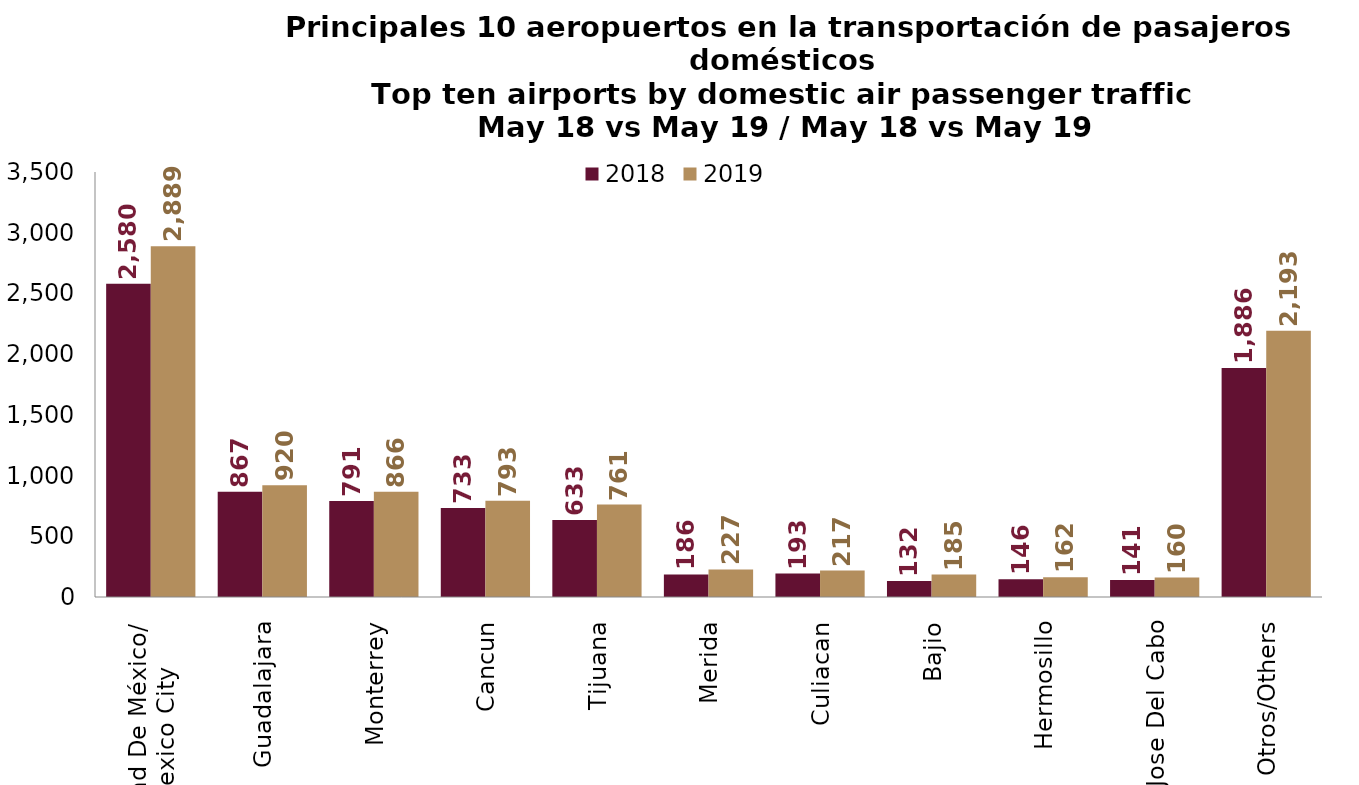
| Category | 2018 | 2019 |
|---|---|---|
| Ciudad De México/
Mexico City | 2580.126 | 2888.679 |
| Guadalajara | 867.047 | 920.146 |
| Monterrey | 790.795 | 866.221 |
| Cancun | 733.343 | 792.854 |
| Tijuana | 633.358 | 760.986 |
| Merida | 185.908 | 226.763 |
| Culiacan | 193.321 | 217.242 |
| Bajio | 132.437 | 184.79 |
| Hermosillo | 146.421 | 162.019 |
| San Jose Del Cabo | 140.689 | 160.204 |
| Otros/Others | 1886.214 | 2193.169 |